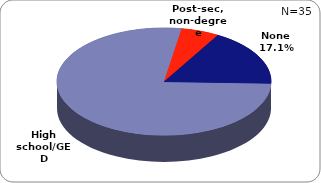
| Category | Series 0 |
|---|---|
| None | 0.171 |
| High school/GED | 0.771 |
| Post-sec, non-degree | 0.057 |